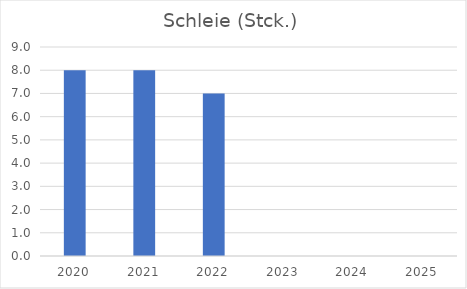
| Category | Schleie (Stck.) |
|---|---|
| 2020.0 | 8 |
| 2021.0 | 8 |
| 2022.0 | 7 |
| 2023.0 | 0 |
| 2024.0 | 0 |
| 2025.0 | 0 |